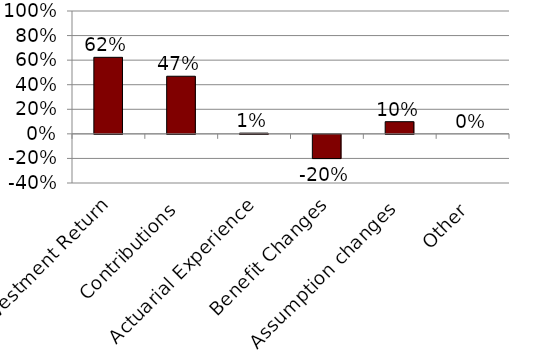
| Category | Series 0 |
|---|---|
| Investment Return | 0.623 |
| Contributions | 0.469 |
| Actuarial Experience | 0.006 |
| Benefit Changes | -0.197 |
| Assumption changes | 0.099 |
| Other | 0 |